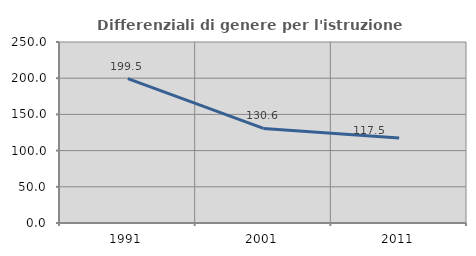
| Category | Differenziali di genere per l'istruzione superiore |
|---|---|
| 1991.0 | 199.476 |
| 2001.0 | 130.607 |
| 2011.0 | 117.497 |